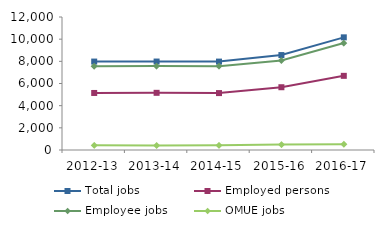
| Category | Total jobs | Employed persons | Employee jobs | OMUE jobs |
|---|---|---|---|---|
| 2012-13 | 7979 | 5146 | 7560 | 423 |
| 2013-14 | 7981 | 5159 | 7569 | 412 |
| 2014-15 | 7976 | 5135 | 7562 | 418 |
| 2015-16 | 8566 | 5664 | 8078 | 485 |
| 2016-17 | 10165 | 6691 | 9648 | 517 |